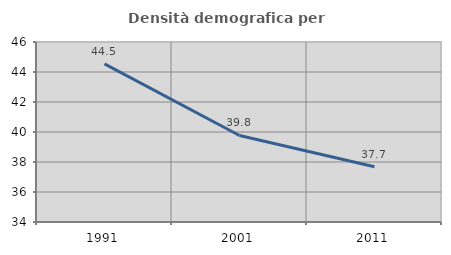
| Category | Densità demografica |
|---|---|
| 1991.0 | 44.539 |
| 2001.0 | 39.767 |
| 2011.0 | 37.685 |